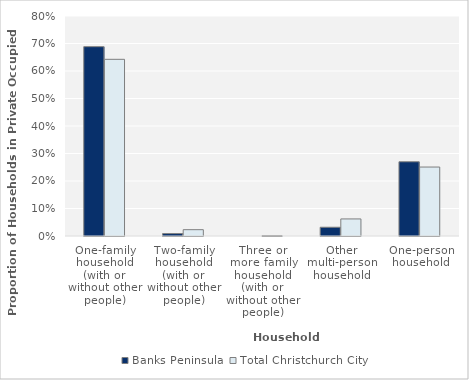
| Category | Banks Peninsula | Total Christchurch City |
|---|---|---|
| One-family household (with or without other people) | 0.688 |  |
| Two-family household (with or without other people) | 0.009 |  |
| Three or more family household (with or without other people) | 0 |  |
| Other multi-person household | 0.032 |  |
| One-person household | 0.27 |  |